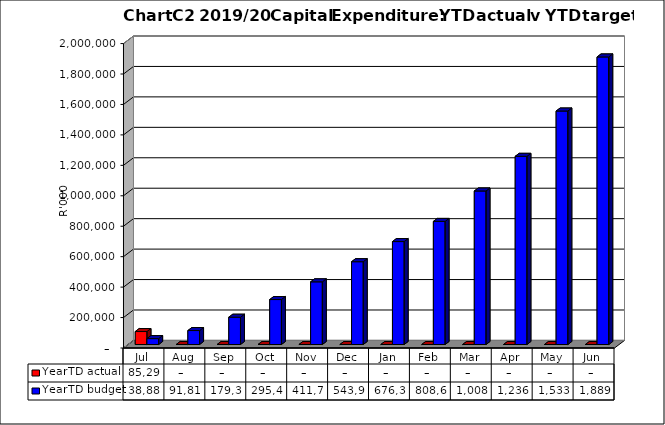
| Category | YearTD actual | YearTD budget |
|---|---|---|
| Jul | 85297669.12 | 38885000 |
| Aug | 0 | 91812000 |
| Sep | 0 | 179333000 |
| Oct | 0 | 295426000 |
| Nov | 0 | 411726000 |
| Dec | 0 | 543992000 |
| Jan | 0 | 676328000 |
| Feb | 0 | 808664000 |
| Mar | 0 | 1008547000 |
| Apr | 0 | 1236223000 |
| May | 0 | 1533926000 |
| Jun | 0 | 1889185999.6 |